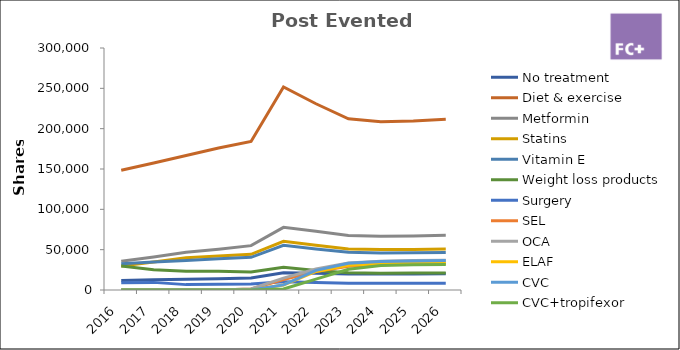
| Category | No treatment | Diet & exercise | Metformin | Statins | Vitamin E | Weight loss products | Surgery | SEL | OCA | ELAF | CVC | CVC+tropifexor |
|---|---|---|---|---|---|---|---|---|---|---|---|---|
| 2016.0 | 11880 | 148500 | 35640 | 29700 | 32670 | 29700 | 8910 | 0 | 0 | 0 | 0 | 0 |
| 2017.0 | 12598.74 | 157484.25 | 40945.905 | 34646.535 | 34646.535 | 25197.48 | 9449.055 | 0 | 0 | 0 | 0 | 0 |
| 2018.0 | 13330.667 | 166633.335 | 46657.334 | 39992 | 36659.334 | 23328.667 | 6665.333 | 0 | 0 | 0 | 0 | 0 |
| 2019.0 | 14075.972 | 175949.653 | 50628.845 | 42227.917 | 38708.924 | 23270.009 | 7037.986 | 0 | 0 | 0 | 0 | 0 |
| 2020.0 | 14834.851 | 184106.81 | 55009.764 | 44185.634 | 40503.498 | 22315.096 | 7364.272 | 1188.863 | 1362.48 | 0 | 0 | 0 |
| 2021.0 | 21360.162 | 251807.115 | 77701.377 | 60433.708 | 55397.565 | 28057.611 | 10072.285 | 12912.574 | 14788.562 | 6207.929 | 6354.992 | 1168.593 |
| 2022.0 | 20709.594 | 230899.07 | 72916.256 | 55415.777 | 50797.795 | 24061.353 | 9235.963 | 22817.698 | 26037.893 | 23030.376 | 24403.433 | 13468.894 |
| 2023.0 | 19839.964 | 212184.205 | 67636.758 | 50924.209 | 46680.525 | 21480.608 | 8487.368 | 29392.916 | 33471.028 | 30563.799 | 33101.236 | 25769.426 |
| 2024.0 | 19733.797 | 208582.506 | 66746.402 | 50059.802 | 45888.151 | 20858.251 | 8343.3 | 31375.447 | 35705.413 | 32388.02 | 35347.874 | 30298.4 |
| 2025.0 | 19881.996 | 209522.24 | 67047.117 | 50285.338 | 46094.893 | 20952.224 | 8380.89 | 32150.746 | 36586.431 | 33016.271 | 36062.019 | 31200.472 |
| 2026.0 | 20080.816 | 211617.463 | 67717.588 | 50788.191 | 46555.842 | 21161.746 | 8464.699 | 32472.253 | 36952.296 | 33346.434 | 36422.639 | 31512.477 |